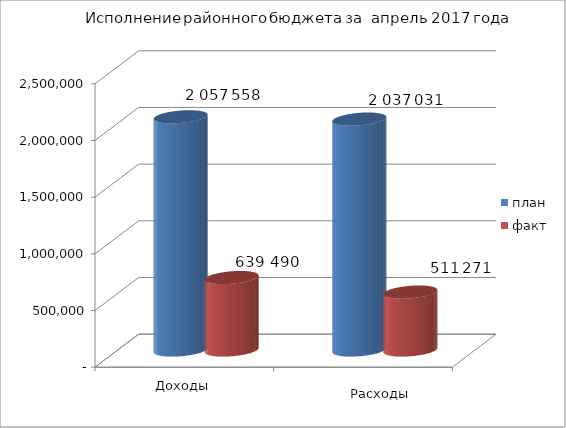
| Category | план | факт |
|---|---|---|
| 0 | 2057558 | 639490 |
| 1 | 2037031 | 511271 |